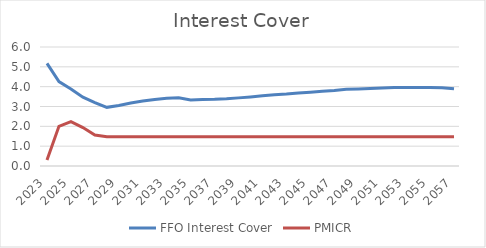
| Category | FFO Interest Cover | PMICR |
|---|---|---|
| 2023.0 | 5.176 | 0.297 |
| 2024.0 | 4.259 | 2.001 |
| 2025.0 | 3.888 | 2.235 |
| 2026.0 | 3.469 | 1.937 |
| 2027.0 | 3.195 | 1.563 |
| 2028.0 | 2.957 | 1.474 |
| 2029.0 | 3.046 | 1.474 |
| 2030.0 | 3.172 | 1.474 |
| 2031.0 | 3.272 | 1.474 |
| 2032.0 | 3.358 | 1.474 |
| 2033.0 | 3.414 | 1.474 |
| 2034.0 | 3.443 | 1.474 |
| 2035.0 | 3.325 | 1.474 |
| 2036.0 | 3.349 | 1.474 |
| 2037.0 | 3.361 | 1.474 |
| 2038.0 | 3.389 | 1.474 |
| 2039.0 | 3.435 | 1.474 |
| 2040.0 | 3.483 | 1.474 |
| 2041.0 | 3.537 | 1.474 |
| 2042.0 | 3.588 | 1.474 |
| 2043.0 | 3.626 | 1.474 |
| 2044.0 | 3.678 | 1.474 |
| 2045.0 | 3.722 | 1.474 |
| 2046.0 | 3.774 | 1.474 |
| 2047.0 | 3.812 | 1.474 |
| 2048.0 | 3.866 | 1.474 |
| 2049.0 | 3.885 | 1.474 |
| 2050.0 | 3.91 | 1.474 |
| 2051.0 | 3.931 | 1.474 |
| 2052.0 | 3.956 | 1.474 |
| 2053.0 | 3.958 | 1.474 |
| 2054.0 | 3.962 | 1.474 |
| 2055.0 | 3.954 | 1.474 |
| 2056.0 | 3.945 | 1.474 |
| 2057.0 | 3.894 | 1.474 |